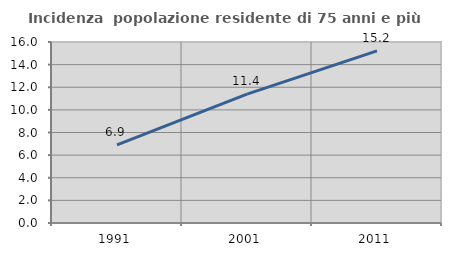
| Category | Incidenza  popolazione residente di 75 anni e più |
|---|---|
| 1991.0 | 6.903 |
| 2001.0 | 11.395 |
| 2011.0 | 15.213 |